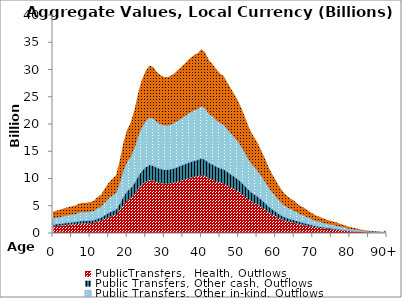
| Category | PublicTransfers,  Health, Outflows | Public Transfers, Other cash, Outflows | Public Transfers, Other in-kind, Outflows | Public Transfers, Education, Outflows |
|---|---|---|---|---|
| 0 | 1231.685 | 352.909 | 1101.368 | 1207.839 |
|  | 1300.844 | 372.725 | 1163.21 | 1275.659 |
| 2 | 1358.271 | 389.18 | 1214.56 | 1331.974 |
| 3 | 1431.512 | 410.165 | 1280.052 | 1403.797 |
| 4 | 1492.82 | 427.731 | 1334.873 | 1463.918 |
| 5 | 1548.039 | 443.553 | 1384.249 | 1518.067 |
| 6 | 1598.878 | 458.119 | 1429.709 | 1567.922 |
| 7 | 1699.003 | 486.808 | 1519.241 | 1666.109 |
| 8 | 1756.348 | 503.239 | 1570.519 | 1722.344 |
| 9 | 1763.132 | 505.183 | 1576.585 | 1728.996 |
| 10 | 1796.099 | 514.628 | 1606.064 | 1761.325 |
| 11 | 1866.916 | 534.919 | 1669.388 | 1830.771 |
| 12 | 2085.588 | 597.575 | 1864.924 | 2045.21 |
| 13 | 2229.389 | 638.777 | 1993.51 | 2186.227 |
| 14 | 2597.089 | 744.133 | 2322.306 | 2546.807 |
| 15 | 2912.692 | 834.561 | 2604.517 | 2856.301 |
| 16 | 3154.4 | 903.817 | 2820.651 | 3093.329 |
| 17 | 3358.566 | 962.315 | 3003.215 | 3293.542 |
| 18 | 4218.468 | 1208.699 | 3772.136 | 4136.795 |
| 19 | 5268.357 | 1509.519 | 4710.942 | 5166.358 |
| 20 | 6009.457 | 1721.864 | 5373.631 | 5893.11 |
| 21 | 6440.444 | 1845.352 | 5759.018 | 6315.752 |
| 22 | 7191.82 | 2060.641 | 6430.895 | 7052.581 |
| 23 | 8177.597 | 2343.091 | 7312.372 | 8019.273 |
| 24 | 8918.835 | 2555.475 | 7975.184 | 8746.159 |
| 25 | 9422.087 | 2699.669 | 8425.189 | 9239.668 |
| 26 | 9716.475 | 2784.019 | 8688.431 | 9528.357 |
| 27 | 9637.493 | 2761.389 | 8617.806 | 9450.904 |
| 28 | 9337.084 | 2675.314 | 8349.181 | 9156.311 |
| 29 | 9164.544 | 2625.877 | 8194.896 | 8987.112 |
| 30 | 9045.804 | 2591.855 | 8088.72 | 8870.671 |
| 31 | 9052.034 | 2593.64 | 8094.29 | 8876.78 |
| 32 | 9161.584 | 2625.029 | 8192.249 | 8984.209 |
| 33 | 9316.16 | 2669.319 | 8330.471 | 9135.793 |
| 34 | 9530.156 | 2730.634 | 8521.825 | 9345.645 |
| 35 | 9732.079 | 2788.49 | 8702.383 | 9543.658 |
| 36 | 9938.788 | 2847.718 | 8887.222 | 9746.366 |
| 37 | 10146.537 | 2907.243 | 9072.99 | 9950.092 |
| 38 | 10321.948 | 2957.503 | 9229.843 | 10122.108 |
| 39 | 10438.198 | 2990.811 | 9333.792 | 10236.107 |
| 40 | 10676.549 | 3059.105 | 9546.924 | 10469.843 |
| 41 | 10472.77 | 3000.717 | 9364.706 | 10270.009 |
| 42 | 10037.784 | 2876.083 | 8975.743 | 9843.445 |
| 43 | 9802.377 | 2808.633 | 8765.244 | 9612.596 |
| 44 | 9504.113 | 2723.172 | 8498.537 | 9320.106 |
| 45 | 9260.322 | 2653.32 | 8280.54 | 9081.035 |
| 46 | 9105.951 | 2609.089 | 8142.502 | 8929.653 |
| 47 | 8730.129 | 2501.406 | 7806.444 | 8561.108 |
| 48 | 8351.54 | 2392.931 | 7467.912 | 8189.848 |
| 49 | 8005.187 | 2293.692 | 7158.204 | 7850.201 |
| 50 | 7613.788 | 2181.546 | 6808.217 | 7466.38 |
| 51 | 7131.355 | 2043.316 | 6376.828 | 6993.287 |
| 52 | 6571.676 | 1882.954 | 5876.365 | 6444.444 |
| 53 | 6015.781 | 1723.676 | 5379.286 | 5899.312 |
| 54 | 5623.907 | 1611.394 | 5028.874 | 5515.024 |
| 55 | 5287.649 | 1515.047 | 4728.193 | 5185.277 |
| 56 | 4835.162 | 1385.398 | 4323.581 | 4741.549 |
| 57 | 4388.462 | 1257.407 | 3924.144 | 4303.498 |
| 58 | 3857.985 | 1105.412 | 3449.794 | 3783.292 |
| 59 | 3431.655 | 983.257 | 3068.571 | 3365.216 |
| 60 | 3079.393 | 882.325 | 2753.58 | 3019.774 |
| 61 | 2695.633 | 772.368 | 2410.423 | 2643.443 |
| 62 | 2390.35 | 684.897 | 2137.441 | 2344.071 |
| 63 | 2166.855 | 620.86 | 1937.592 | 2124.903 |
| 64 | 2005.959 | 574.759 | 1793.72 | 1967.122 |
| 65 | 1870.909 | 536.063 | 1672.959 | 1834.687 |
| 66 | 1668.054 | 477.94 | 1491.567 | 1635.76 |
| 67 | 1542.565 | 441.985 | 1379.355 | 1512.7 |
| 68 | 1409.131 | 403.752 | 1260.039 | 1381.849 |
| 69 | 1265.106 | 362.485 | 1131.252 | 1240.612 |
| 70 | 1124.394 | 322.168 | 1005.428 | 1102.625 |
| 71 | 999.661 | 286.428 | 893.892 | 980.306 |
| 72 | 922.151 | 264.22 | 824.584 | 904.298 |
| 73 | 834.63 | 239.143 | 746.323 | 818.471 |
| 74 | 756.483 | 216.752 | 676.444 | 741.837 |
| 75 | 701.186 | 200.908 | 626.997 | 687.61 |
| 76 | 641.05 | 183.677 | 573.224 | 628.638 |
| 77 | 564.774 | 161.822 | 505.019 | 553.84 |
| 78 | 489.19 | 140.166 | 437.432 | 479.719 |
| 79 | 412.947 | 118.32 | 369.256 | 404.952 |
| 80 | 354.413 | 101.548 | 316.915 | 347.551 |
| 81 | 300.347 | 86.057 | 268.569 | 294.532 |
| 82 | 251.635 | 72.1 | 225.011 | 246.764 |
| 83 | 200.608 | 57.479 | 179.383 | 196.724 |
| 84 | 155.994 | 44.696 | 139.489 | 152.974 |
| 85 | 133.338 | 38.205 | 119.23 | 130.756 |
| 86 | 113.207 | 32.437 | 101.229 | 111.015 |
| 87 | 91.729 | 26.283 | 82.024 | 89.953 |
| 88 | 73.081 | 20.939 | 65.348 | 71.666 |
| 89 | 56.071 | 16.066 | 50.139 | 54.986 |
| 90+ | 212.513 | 60.89 | 190.028 | 208.399 |